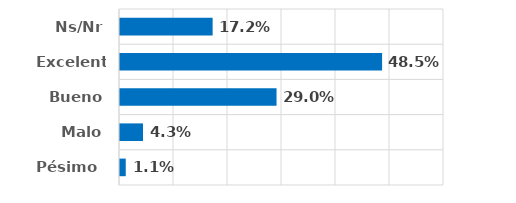
| Category | Series 0 |
|---|---|
| Pésimo  | 0.011 |
| Malo | 0.043 |
| Bueno | 0.29 |
| Excelente | 0.485 |
| Ns/Nr | 0.172 |